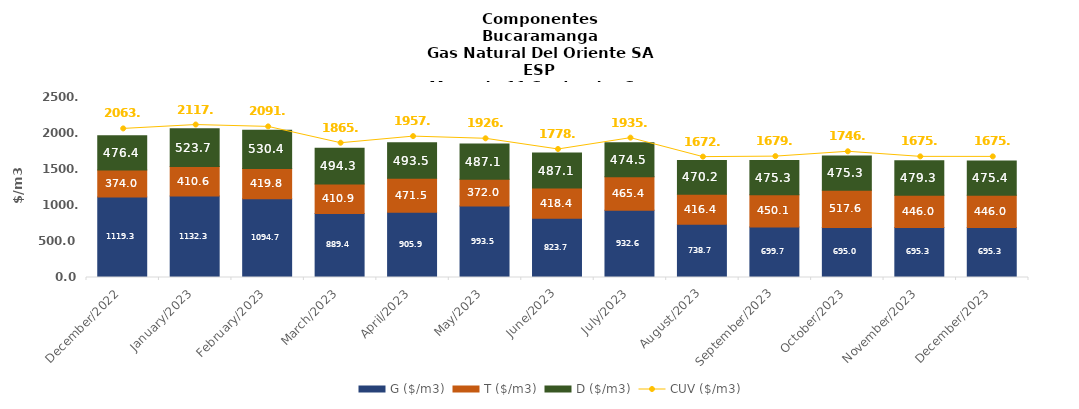
| Category | G ($/m3) | T ($/m3) | D ($/m3) |
|---|---|---|---|
| 2022-12-01 | 1119.25 | 374.03 | 476.36 |
| 2023-01-01 | 1132.3 | 410.55 | 523.74 |
| 2023-02-01 | 1094.71 | 419.79 | 530.39 |
| 2023-03-01 | 889.39 | 410.92 | 494.25 |
| 2023-04-01 | 905.91 | 471.46 | 493.54 |
| 2023-05-01 | 993.53 | 372.04 | 487.06 |
| 2023-06-01 | 823.66 | 418.43 | 487.06 |
| 2023-07-01 | 932.63 | 465.37 | 474.47 |
| 2023-08-01 | 738.7 | 416.42 | 470.2 |
| 2023-09-01 | 699.68 | 450.11 | 475.33 |
| 2023-10-01 | 694.96 | 517.63 | 475.33 |
| 2023-11-01 | 695.28 | 446.03 | 479.27 |
| 2023-12-01 | 695.28 | 446.03 | 475.44 |